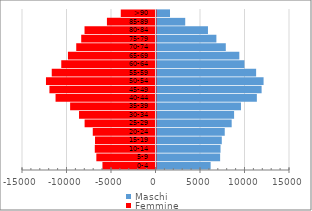
| Category | Maschi | Femmine |
|---|---|---|
| 0-4 | 6082 | -5961 |
| 5-9 | 7149 | -6647 |
| 10-14 | 7194 | -6821 |
| 15-19 | 7337 | -6796 |
| 20-24 | 7668 | -7048 |
| 25-29 | 8447 | -7965 |
| 30-34 | 8718 | -8592 |
| 35-39 | 9491 | -9593 |
| 40-44 | 11277 | -11230 |
| 45-49 | 11811 | -11919 |
| 50-54 | 12031 | -12306 |
| 55-59 | 11194 | -11658 |
| 60-64 | 9882 | -10588 |
| 65-69 | 9306 | -9836 |
| 70-74 | 7786 | -8906 |
| 75-79 | 6729 | -8347 |
| 80-84 | 5783 | -7974 |
| 85-89 | 3228 | -5457 |
| >90 | 1519 | -3902 |